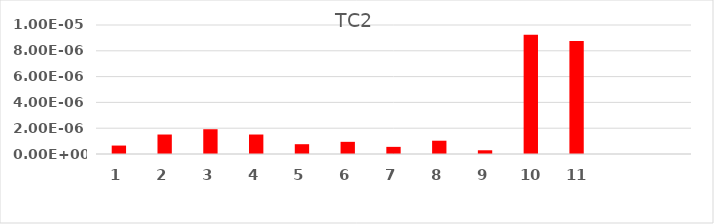
| Category | TC2 |
|---|---|
| 1.0 | 0 |
| 2.0 | 0 |
| 3.0 | 0 |
| 4.0 | 0 |
| 5.0 | 0 |
| 6.0 | 0 |
| 7.0 | 0 |
| 8.0 | 0 |
| 9.0 | 0 |
| 10.0 | 0 |
| 11.0 | 0 |